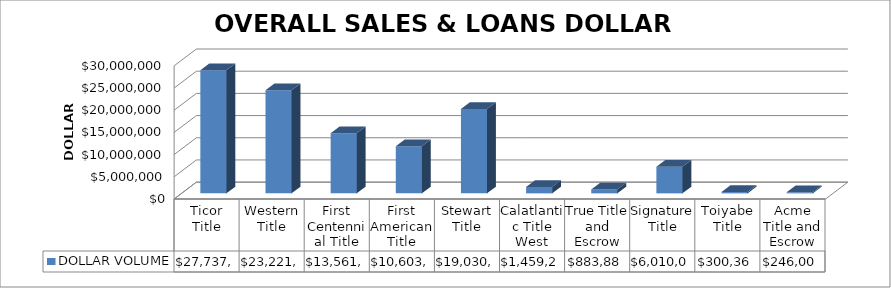
| Category | DOLLAR VOLUME |
|---|---|
| Ticor Title | 27737286 |
| Western Title | 23221446 |
| First Centennial Title | 13561162 |
| First American Title | 10603424.89 |
| Stewart Title | 19030000 |
| Calatlantic Title West | 1459216 |
| True Title and Escrow | 883880 |
| Signature Title | 6010000 |
| Toiyabe Title | 300366 |
| Acme Title and Escrow | 246000 |